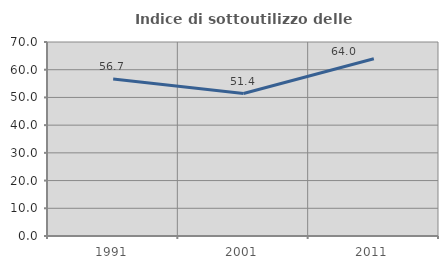
| Category | Indice di sottoutilizzo delle abitazioni  |
|---|---|
| 1991.0 | 56.667 |
| 2001.0 | 51.402 |
| 2011.0 | 63.964 |